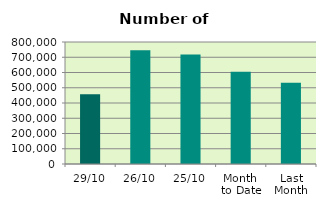
| Category | Series 0 |
|---|---|
| 29/10 | 457970 |
| 26/10 | 745690 |
| 25/10 | 718216 |
| Month 
to Date | 605480.667 |
| Last
Month | 533338.9 |